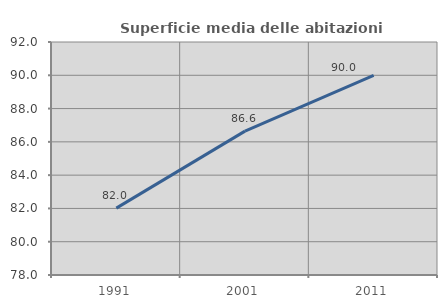
| Category | Superficie media delle abitazioni occupate |
|---|---|
| 1991.0 | 82.019 |
| 2001.0 | 86.646 |
| 2011.0 | 89.99 |